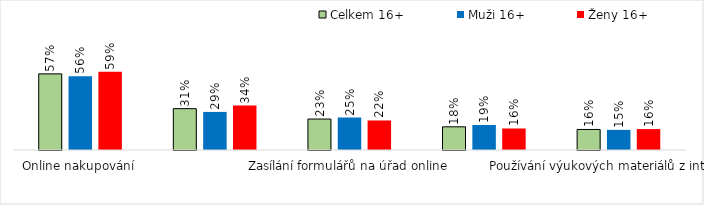
| Category | Celkem 16+ | Muži 16+ | Ženy 16+ |
|---|---|---|---|
| Online nakupování | 0.575 | 0.557 | 0.591 |
| Objednání se k lékaři, na očkování či COVID testy | 0.312 | 0.287 | 0.335 |
| Zasílání formulářů na úřad online | 0.234 | 0.245 | 0.223 |
| Ověřování pravdivosti informací z internetu | 0.175 | 0.188 | 0.162 |
| Používání výukových materiálů z internetu | 0.155 | 0.152 | 0.158 |